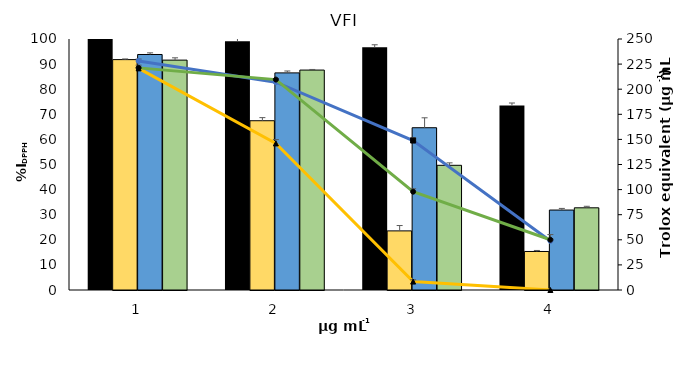
| Category | Trolox | Acetone | MeOH | EtOH 70% |
|---|---|---|---|---|
| 0 | 100 | 91.783 | 93.827 | 91.586 |
| 1 | 99.1 | 67.442 | 86.502 | 87.621 |
| 2 | 96.7 | 23.55 | 64.65 | 49.676 |
| 3 | 73.5 | 15.349 | 31.852 | 32.745 |